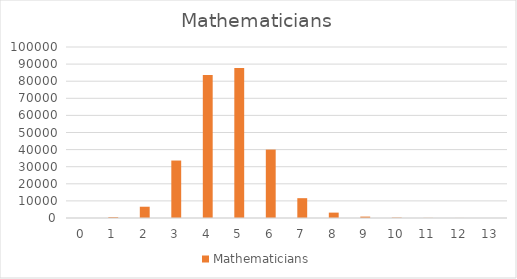
| Category | Mathematicians |
|---|---|
| 0.0 | 1 |
| 1.0 | 504 |
| 2.0 | 6593 |
| 3.0 | 33605 |
| 4.0 | 83642 |
| 5.0 | 87760 |
| 6.0 | 40014 |
| 7.0 | 11591 |
| 8.0 | 3146 |
| 9.0 | 819 |
| 10.0 | 244 |
| 11.0 | 68 |
| 12.0 | 23 |
| 13.0 | 5 |